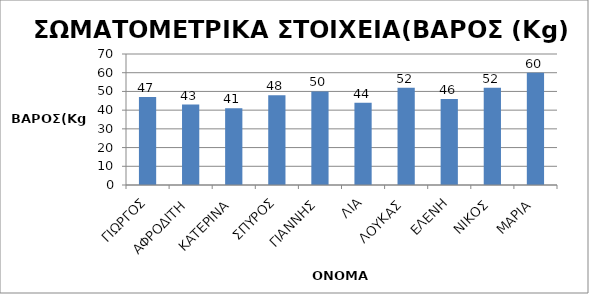
| Category | ΒΑΡΟΣ (Kg) |
|---|---|
| ΓΙΩΡΓΟΣ | 47 |
| ΑΦΡΟΔΙΤΗ | 43 |
| ΚΑΤΕΡΙΝΑ | 41 |
| ΣΠΥΡΟΣ | 48 |
| ΓΙΑΝΝΗΣ | 50 |
| ΛΙΑ | 44 |
| ΛΟΥΚΑΣ | 52 |
| ΕΛΕΝΗ | 46 |
| ΝΙΚΟΣ | 52 |
| ΜΑΡΙΑ | 60 |